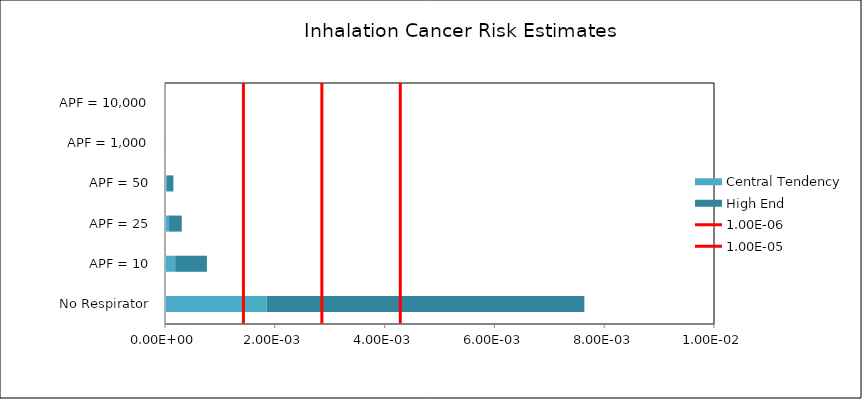
| Category | Central Tendency | High End |
|---|---|---|
| No Respirator | 0.002 | 0.006 |
| APF = 10 | 0 | 0.001 |
| APF = 25 | 0 | 0 |
| APF = 50 | 0 | 0 |
| APF = 1,000 | 0 | 0 |
| APF = 10,000 | 0 | 0 |